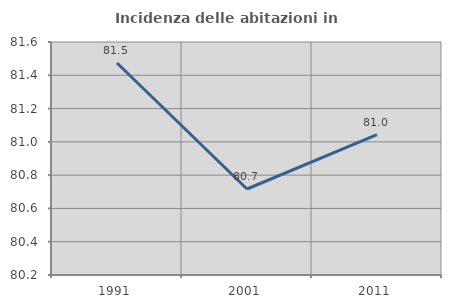
| Category | Incidenza delle abitazioni in proprietà  |
|---|---|
| 1991.0 | 81.474 |
| 2001.0 | 80.717 |
| 2011.0 | 81.044 |